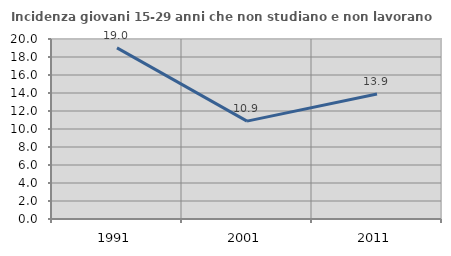
| Category | Incidenza giovani 15-29 anni che non studiano e non lavorano  |
|---|---|
| 1991.0 | 19.016 |
| 2001.0 | 10.875 |
| 2011.0 | 13.898 |